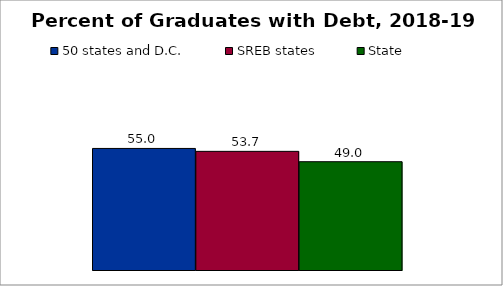
| Category | 50 states and D.C. | SREB states | State |
|---|---|---|---|
| 0 | 55 | 53.688 | 49 |